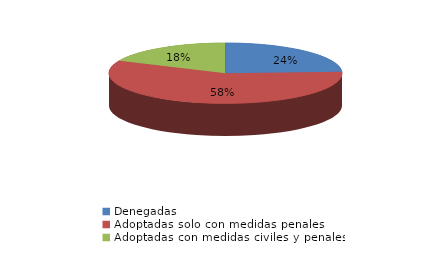
| Category | Series 0 |
|---|---|
| Denegadas | 8 |
| Adoptadas solo con medidas penales | 19 |
| Adoptadas con medidas civiles y penales | 6 |
| Adoptadas con medidas civiles | 0 |